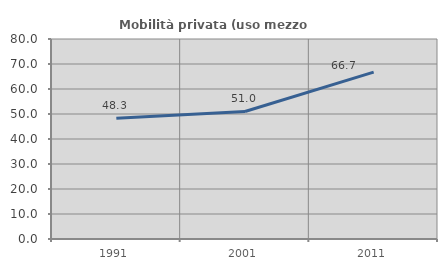
| Category | Mobilità privata (uso mezzo privato) |
|---|---|
| 1991.0 | 48.283 |
| 2001.0 | 51.011 |
| 2011.0 | 66.736 |